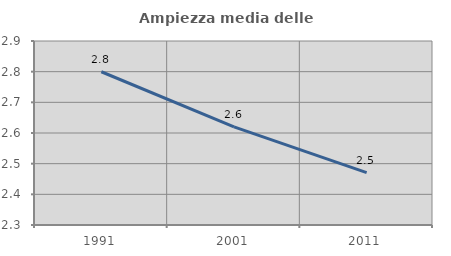
| Category | Ampiezza media delle famiglie |
|---|---|
| 1991.0 | 2.8 |
| 2001.0 | 2.62 |
| 2011.0 | 2.471 |